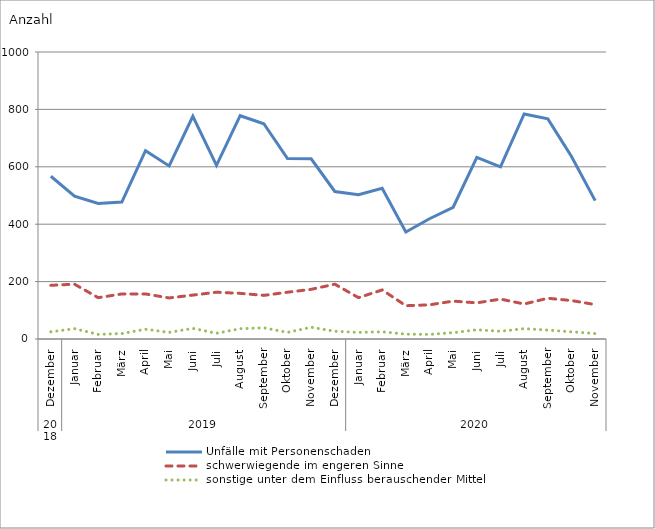
| Category | Unfälle mit Personenschaden | schwerwiegende im engeren Sinne | sonstige unter dem Einfluss berauschender Mittel |
|---|---|---|---|
| 0 | 567 | 187 | 25 |
| 1 | 498 | 191 | 36 |
| 2 | 472 | 144 | 16 |
| 3 | 477 | 157 | 19 |
| 4 | 656 | 157 | 34 |
| 5 | 603 | 143 | 23 |
| 6 | 776 | 153 | 37 |
| 7 | 605 | 163 | 20 |
| 8 | 778 | 159 | 36 |
| 9 | 750 | 152 | 39 |
| 10 | 629 | 163 | 23 |
| 11 | 628 | 173 | 41 |
| 12 | 514 | 191 | 27 |
| 13 | 503 | 144 | 23 |
| 14 | 525 | 171 | 25 |
| 15 | 373 | 116 | 17 |
| 16 | 419 | 119 | 16 |
| 17 | 459 | 132 | 22 |
| 18 | 633 | 126 | 32 |
| 19 | 600 | 139 | 27 |
| 20 | 784 | 122 | 36 |
| 21 | 767 | 142 | 31 |
| 22 | 636 | 134 | 25 |
| 23 | 482 | 120 | 19 |